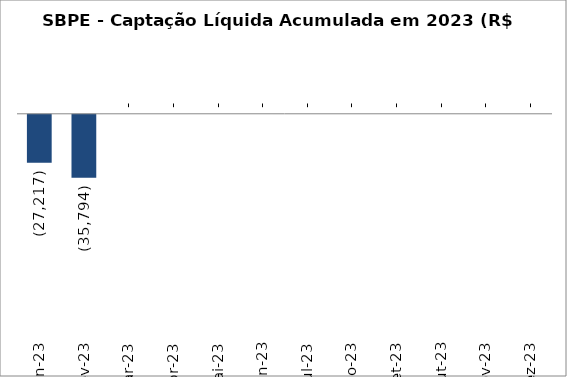
| Category | SBPE - Captação Líquida Acumulada em 2023 (R$ Milhões)  |
|---|---|
| Jan-23 | -27216.822 |
| Fev-23 | -35793.696 |
| Mar-23 | 0 |
| Abr-23 | 0 |
| Mai-23 | 0 |
| Jun-23 | 0 |
| Jul-23 | 0 |
| Ago-23 | 0 |
| Set-23 | 0 |
| Out-23 | 0 |
| Nov-23 | 0 |
| Dez-23 | 0 |